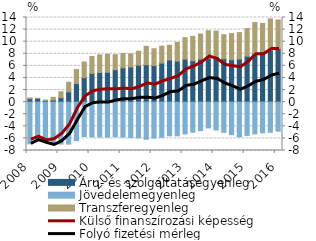
| Category | Áru- és szolgáltatásegyenleg | Jövedelemegyenleg | Transzferegyenleg |
|---|---|---|---|
| 2008.0 | 0.545 | -6.893 | 0.145 |
| 2008.0 | 0.611 | -6.354 | 0.016 |
| 2008.0 | 0.277 | -6.665 | 0.057 |
| 2008.0 | 0.358 | -6.913 | 0.436 |
| 2009.0 | 0.729 | -6.937 | 0.988 |
| 2009.0 | 1.7 | -6.942 | 1.591 |
| 2009.0 | 3.071 | -6.372 | 2.32 |
| 2009.0 | 4.043 | -5.685 | 2.6 |
| 2010.0 | 4.753 | -5.745 | 2.802 |
| 2010.0 | 4.906 | -5.77 | 2.915 |
| 2010.0 | 4.937 | -5.789 | 2.995 |
| 2010.0 | 5.357 | -5.732 | 2.484 |
| 2011.0 | 5.668 | -5.787 | 2.368 |
| 2011.0 | 5.818 | -5.859 | 2.159 |
| 2011.0 | 6.112 | -5.909 | 2.323 |
| 2011.0 | 6.17 | -6.147 | 3.062 |
| 2012.0 | 6.051 | -5.94 | 2.78 |
| 2012.0 | 6.46 | -5.821 | 2.799 |
| 2012.0 | 6.976 | -5.568 | 2.43 |
| 2012.0 | 6.79 | -5.563 | 3.086 |
| 2013.0 | 7.117 | -5.258 | 3.546 |
| 2013.0 | 6.851 | -4.97 | 4.029 |
| 2013.0 | 7.131 | -4.712 | 4.146 |
| 2013.0 | 7.296 | -4.263 | 4.515 |
| 2014.0 | 7.48 | -4.611 | 4.271 |
| 2014.0 | 7.189 | -4.992 | 3.97 |
| 2014.0 | 7.015 | -5.384 | 4.327 |
| 2014.0 | 7.146 | -5.742 | 4.354 |
| 2015.0 | 7.591 | -5.504 | 4.582 |
| 2015.0 | 8.051 | -5.259 | 5.114 |
| 2015.0 | 8.305 | -5.083 | 4.721 |
| 2015.0 | 8.596 | -4.984 | 5.156 |
| 2016.0 | 8.832 | -4.805 | 4.76 |